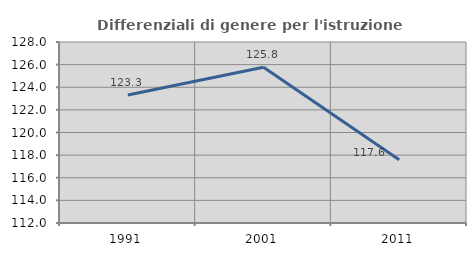
| Category | Differenziali di genere per l'istruzione superiore |
|---|---|
| 1991.0 | 123.316 |
| 2001.0 | 125.771 |
| 2011.0 | 117.586 |